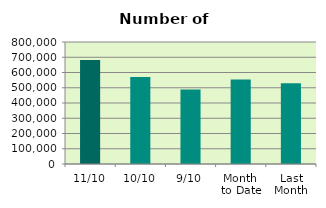
| Category | Series 0 |
|---|---|
| 11/10 | 681178 |
| 10/10 | 571166 |
| 9/10 | 489344 |
| Month 
to Date | 554329.778 |
| Last
Month | 529677.905 |